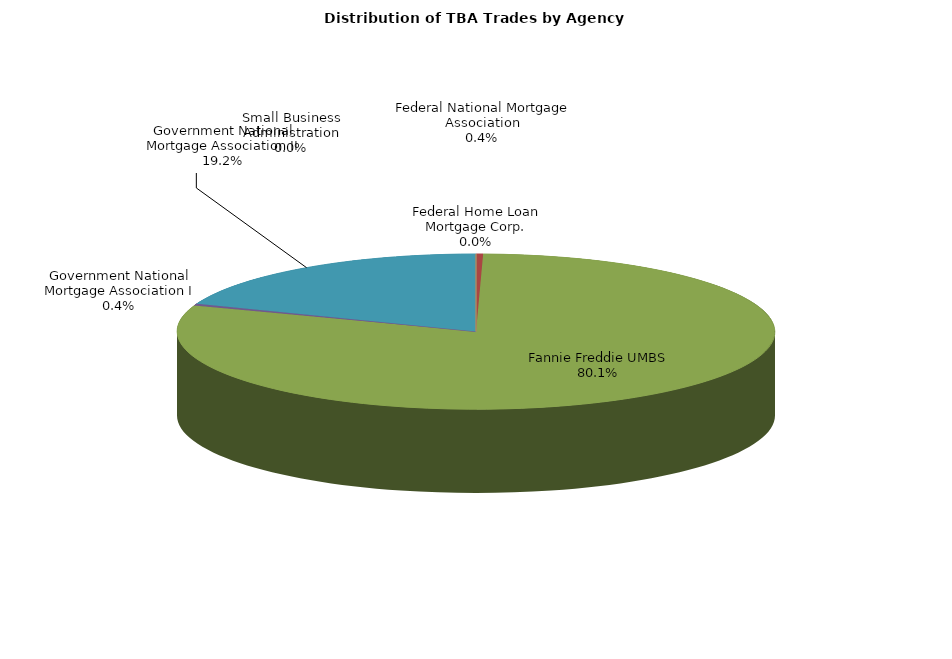
| Category | Series 0 |
|---|---|
| Federal Home Loan Mortgage Corp. | 0.593 |
| Federal National Mortgage Association | 30 |
| Fannie Freddie UMBS | 6446.036 |
| Government National Mortgage Association I | 28.644 |
| Government National Mortgage Association II | 1543.711 |
| Small Business Administration | 0 |